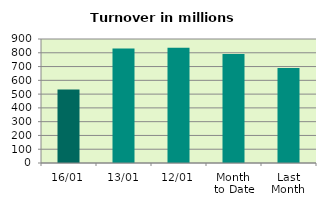
| Category | Series 0 |
|---|---|
| 16/01 | 533.607 |
| 13/01 | 830.584 |
| 12/01 | 836.223 |
| Month 
to Date | 790.975 |
| Last
Month | 689.27 |